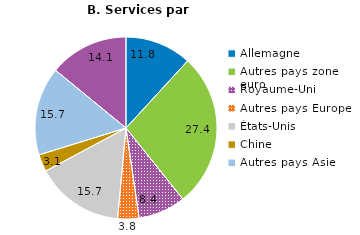
| Category | Exportation de services par destination |
|---|---|
| Allemagne |  |
| Autres pays zone euro |  |
| Royaume-Uni |  |
| Autres pays Europe |  |
| États-Unis |  |
| Chine |  |
| Autres pays Asie |  |
| Autres |  |